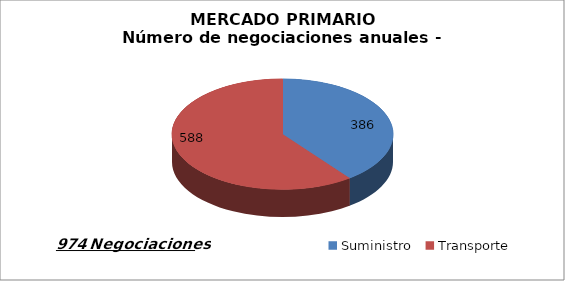
| Category | Mercado Primario |
|---|---|
| Suministro | 386 |
| Transporte | 588 |